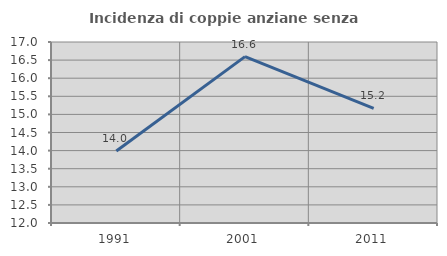
| Category | Incidenza di coppie anziane senza figli  |
|---|---|
| 1991.0 | 13.99 |
| 2001.0 | 16.596 |
| 2011.0 | 15.164 |